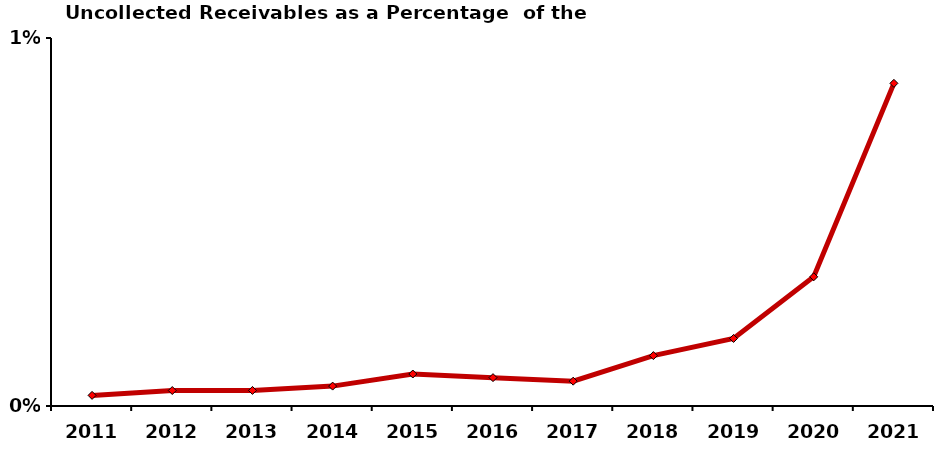
| Category | % Change from Prior Years |
|---|---|
| 2011.0 | 0 |
| 2012.0 | 0 |
| 2013.0 | 0 |
| 2014.0 | 0.001 |
| 2015.0 | 0.001 |
| 2016.0 | 0.001 |
| 2017.0 | 0.001 |
| 2018.0 | 0.001 |
| 2019.0 | 0.002 |
| 2020.0 | 0.004 |
| 2021.0 | 0.009 |